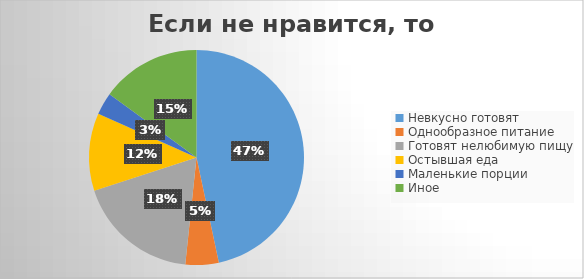
| Category | Series 0 |
|---|---|
| Невкусно готовят | 28 |
| Однообразное питание | 3 |
| Готовят нелюбимую пищу | 11 |
| Остывшая еда | 7 |
| Маленькие порции | 2 |
| Иное | 9 |